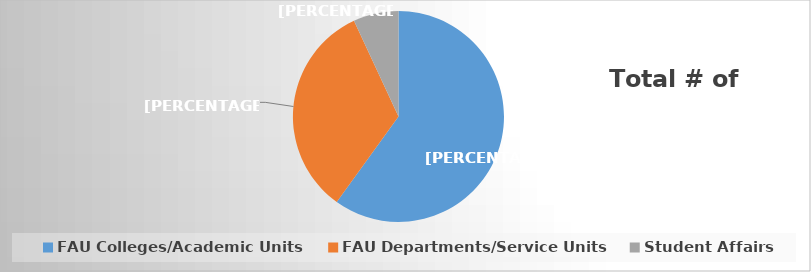
| Category | Series 0 |
|---|---|
| FAU Colleges/Academic Units | 0.6 |
| FAU Departments/Service Units | 0.331 |
| Student Affairs | 0.069 |